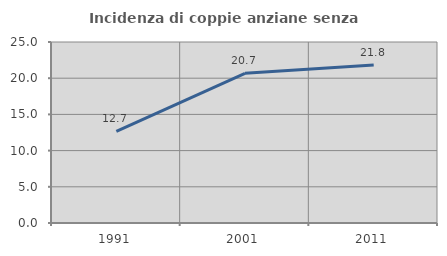
| Category | Incidenza di coppie anziane senza figli  |
|---|---|
| 1991.0 | 12.668 |
| 2001.0 | 20.681 |
| 2011.0 | 21.839 |